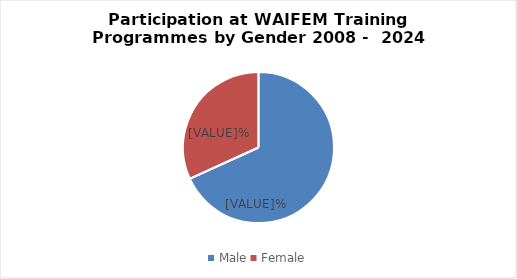
| Category | Series 0 |
|---|---|
| Male | 0.682 |
| Female | 0.318 |